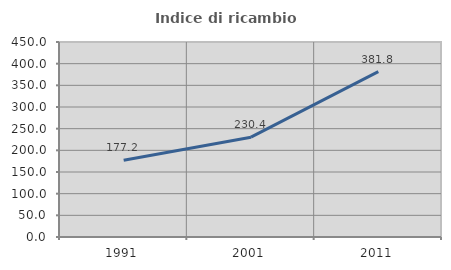
| Category | Indice di ricambio occupazionale  |
|---|---|
| 1991.0 | 177.232 |
| 2001.0 | 230.366 |
| 2011.0 | 381.818 |